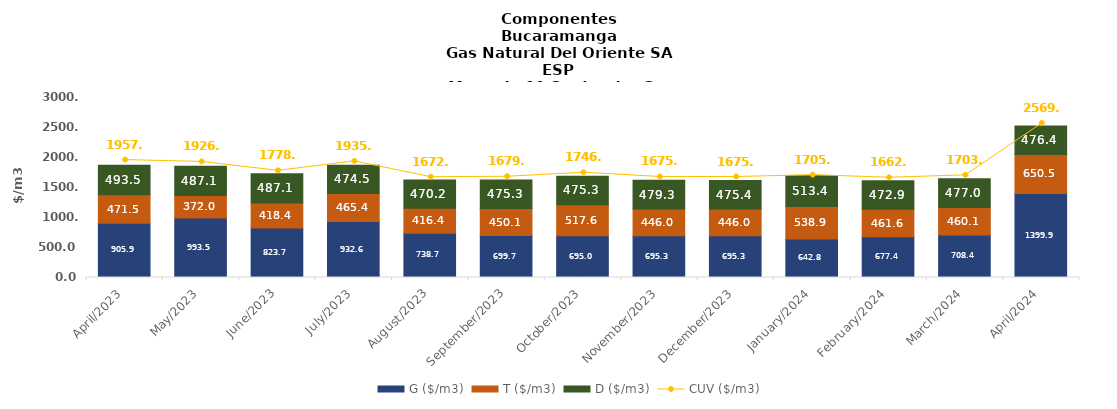
| Category | G ($/m3) | T ($/m3) | D ($/m3) |
|---|---|---|---|
| 2023-04-01 | 905.91 | 471.46 | 493.54 |
| 2023-05-01 | 993.53 | 372.04 | 487.06 |
| 2023-06-01 | 823.66 | 418.43 | 487.06 |
| 2023-07-01 | 932.63 | 465.37 | 474.47 |
| 2023-08-01 | 738.7 | 416.42 | 470.2 |
| 2023-09-01 | 699.68 | 450.11 | 475.33 |
| 2023-10-01 | 694.96 | 517.63 | 475.33 |
| 2023-11-01 | 695.28 | 446.03 | 479.27 |
| 2023-12-01 | 695.28 | 446.03 | 475.44 |
| 2024-01-01 | 642.83 | 538.87 | 513.39 |
| 2024-02-01 | 677.42 | 461.59 | 472.92 |
| 2024-03-01 | 708.44 | 460.14 | 477.03 |
| 2024-04-01 | 1399.86 | 650.49 | 476.39 |